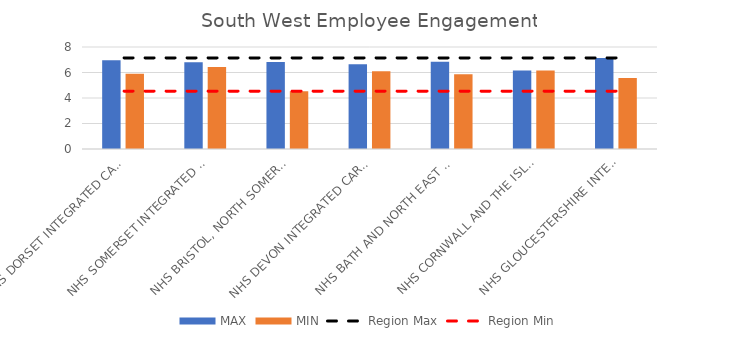
| Category | MAX | MIN |
|---|---|---|
| NHS DORSET INTEGRATED CARE BOARD | 6.953 | 5.909 |
| NHS SOMERSET INTEGRATED CARE BOARD | 6.808 | 6.432 |
| NHS BRISTOL, NORTH SOMERSET AND SOUTH GLOUCESTERSHIRE INTEGRATED CARE BOARD | 6.821 | 4.539 |
| NHS DEVON INTEGRATED CARE BOARD | 6.649 | 6.099 |
| NHS BATH AND NORTH EAST SOMERSET, SWINDON AND WILTSHIRE INTEGRATED CARE BOARD | 6.842 | 5.863 |
| NHS CORNWALL AND THE ISLES OF SCILLY INTEGRATED CARE BOARD | 6.159 | 6.159 |
| NHS GLOUCESTERSHIRE INTEGRATED CARE BOARD | 7.146 | 5.561 |